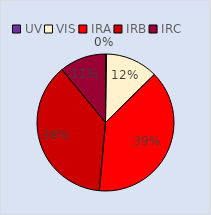
| Category | Series 0 |
|---|---|
| UV | 0.002 |
| VIS | 0.124 |
| IRA | 0.388 |
| IRB | 0.376 |
| IRC | 0.11 |